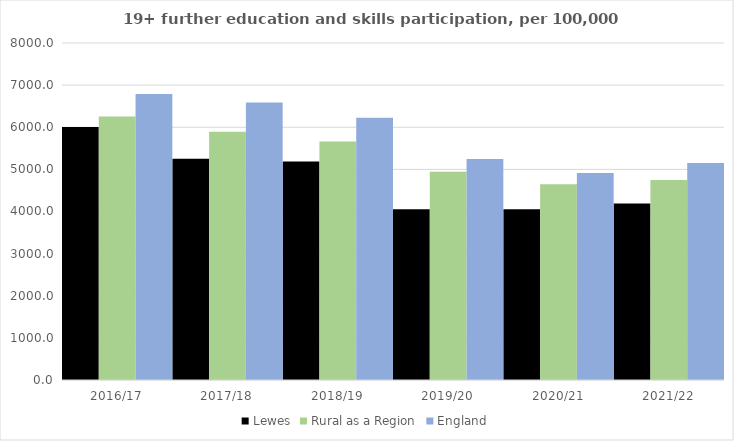
| Category | Lewes | Rural as a Region | England |
|---|---|---|---|
| 2016/17 | 6005 | 6253.401 | 6788 |
| 2017/18 | 5253 | 5892.029 | 6588 |
| 2018/19 | 5189 | 5661.873 | 6227 |
| 2019/20 | 4055 | 4943.801 | 5244 |
| 2020/21 | 4053 | 4646.727 | 4913 |
| 2021/22 | 4189 | 4747.049 | 5151 |